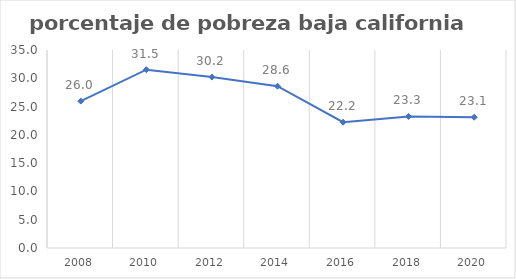
| Category | Series 0 |
|---|---|
| 2008.0 | 25.964 |
| 2010.0 | 31.52 |
| 2012.0 | 30.209 |
| 2014.0 | 28.598 |
| 2016.0 | 22.233 |
| 2018.0 | 23.257 |
| 2020.0 | 23.117 |